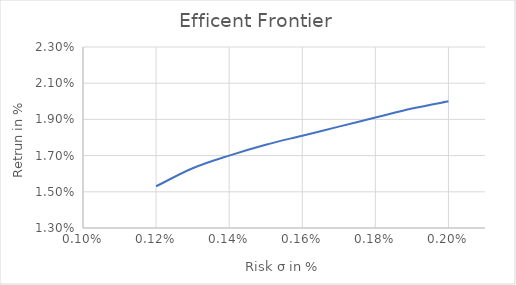
| Category | Efficent Frontier |
|---|---|
| 0.0012 | 0.015 |
| 0.0013 | 0.016 |
| 0.0014 | 0.017 |
| 0.0015 | 0.018 |
| 0.0016 | 0.018 |
| 0.0017 | 0.019 |
| 0.0018 | 0.019 |
| 0.0019 | 0.02 |
| 0.002 | 0.02 |